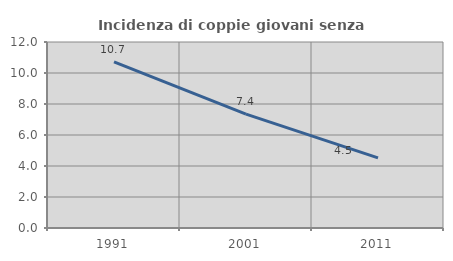
| Category | Incidenza di coppie giovani senza figli |
|---|---|
| 1991.0 | 10.718 |
| 2001.0 | 7.35 |
| 2011.0 | 4.526 |